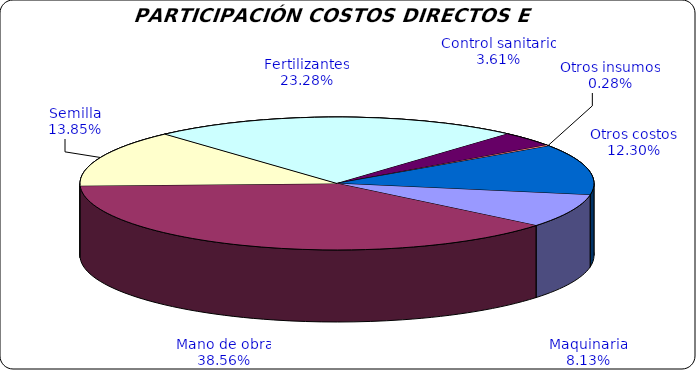
| Category | Series 0 |
|---|---|
| Maquinaria | 317200 |
| Mano de obra | 1505000 |
| Semilla | 540500 |
| Fertilizantes | 908500 |
| Control sanitario | 140789.5 |
| Otros insumos | 11000 |
| Otros costos | 480000 |